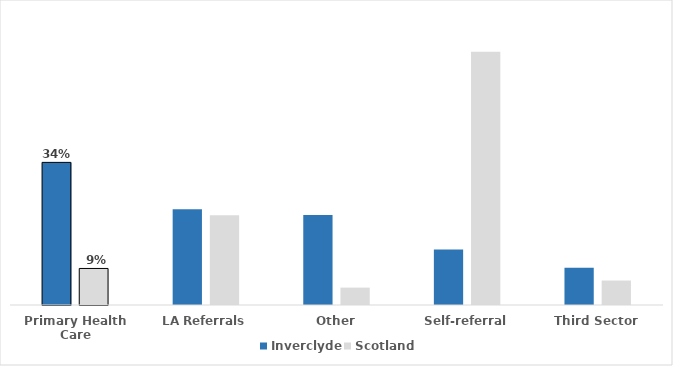
| Category | Inverclyde | Scotland |
|---|---|---|
| Primary Health Care | 0.338 | 0.087 |
| LA Referrals | 0.227 | 0.213 |
| Other | 0.214 | 0.041 |
| Self-referral | 0.132 | 0.601 |
| Third Sector | 0.088 | 0.058 |